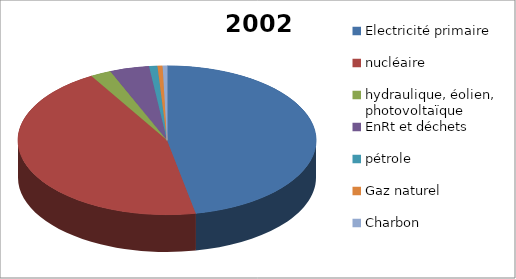
| Category | 2002 | 2010 |
|---|---|---|
| Electricité primaire | 119.6 | 118.4 |
| nucléaire | 113.8 | 111.7 |
| hydraulique, éolien, photovoltaïque | 5.7 | 6.7 |
| EnRt et déchets | 10.9 | 17.6 |
| pétrole | 2.3 | 1.8 |
| Gaz naturel | 1.4 | 0.6 |
| Charbon | 1.2 | 0.1 |